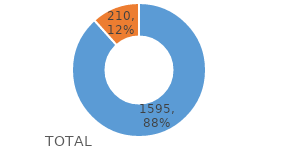
| Category | Series 0 |
|---|---|
| Si Cumple | 1595 |
| No Cumple | 210 |